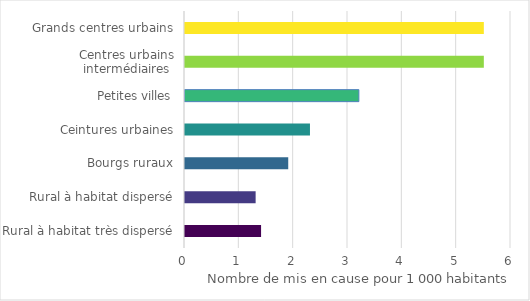
| Category | Series 0 |
|---|---|
| Grands centres urbains | 5.5 |
| Centres urbains intermédiaires | 5.5 |
| Petites villes | 3.2 |
| Ceintures urbaines | 2.3 |
| Bourgs ruraux | 1.9 |
| Rural à habitat dispersé | 1.3 |
| Rural à habitat très dispersé | 1.4 |